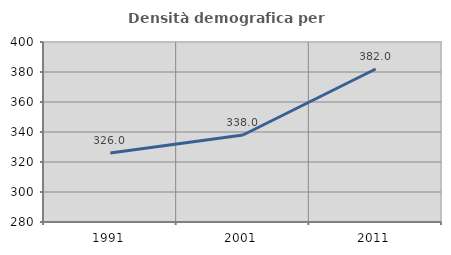
| Category | Densità demografica |
|---|---|
| 1991.0 | 325.994 |
| 2001.0 | 338.011 |
| 2011.0 | 382.006 |